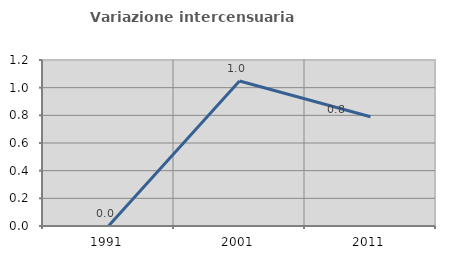
| Category | Variazione intercensuaria annua |
|---|---|
| 1991.0 | 0 |
| 2001.0 | 1.049 |
| 2011.0 | 0.789 |